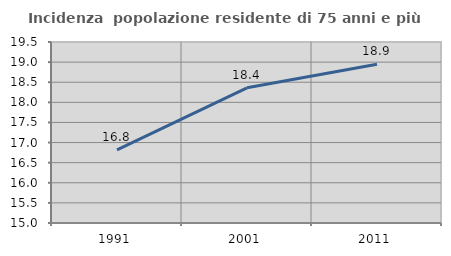
| Category | Incidenza  popolazione residente di 75 anni e più |
|---|---|
| 1991.0 | 16.819 |
| 2001.0 | 18.36 |
| 2011.0 | 18.947 |